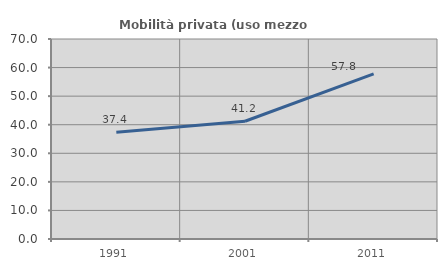
| Category | Mobilità privata (uso mezzo privato) |
|---|---|
| 1991.0 | 37.378 |
| 2001.0 | 41.222 |
| 2011.0 | 57.819 |